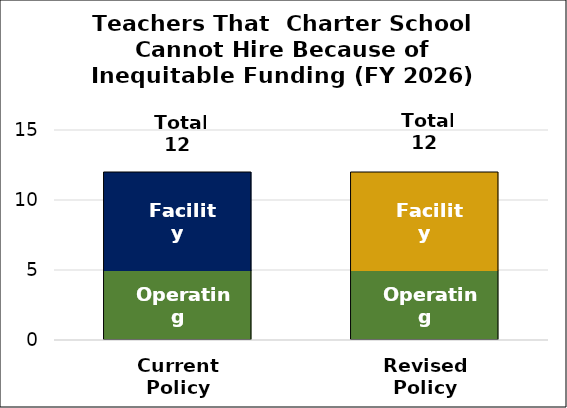
| Category |  Operating |  Facility |
|---|---|---|
| Current
Policy | 5 | 7 |
| Revised
Policy | 5 | 7 |